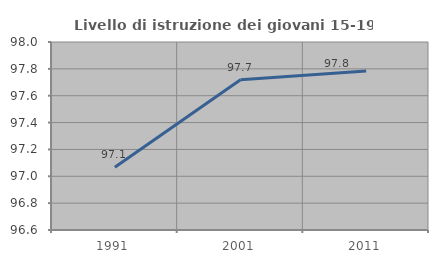
| Category | Livello di istruzione dei giovani 15-19 anni |
|---|---|
| 1991.0 | 97.067 |
| 2001.0 | 97.719 |
| 2011.0 | 97.785 |